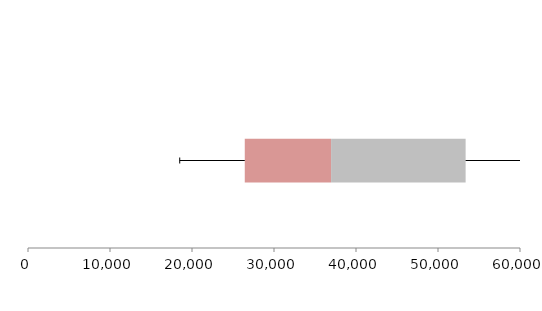
| Category | Series 1 | Series 2 | Series 3 |
|---|---|---|---|
| 0 | 26435.006 | 10526.881 | 16406.71 |